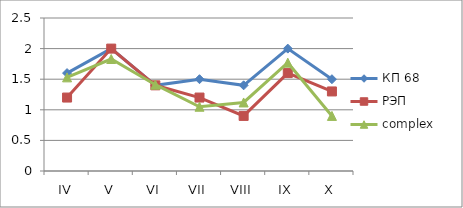
| Category | КП 68 | РЭП  | complex |
|---|---|---|---|
| IV | 1.6 | 1.2 | 1.53 |
| V | 2 | 2 | 1.83 |
| VI | 1.4 | 1.4 | 1.41 |
| VII | 1.5 | 1.2 | 1.05 |
| VIII | 1.4 | 0.9 | 1.12 |
| IX | 2 | 1.6 | 1.77 |
| X | 1.5 | 1.3 | 0.9 |